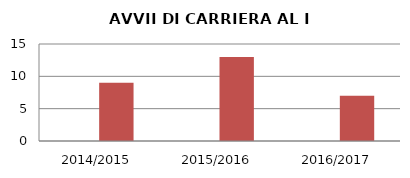
| Category | ANNO | NUMERO |
|---|---|---|
| 2014/2015 | 0 | 9 |
| 2015/2016 | 0 | 13 |
| 2016/2017 | 0 | 7 |